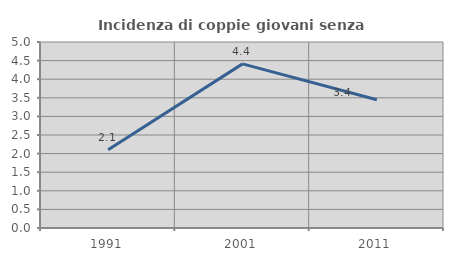
| Category | Incidenza di coppie giovani senza figli |
|---|---|
| 1991.0 | 2.103 |
| 2001.0 | 4.412 |
| 2011.0 | 3.448 |